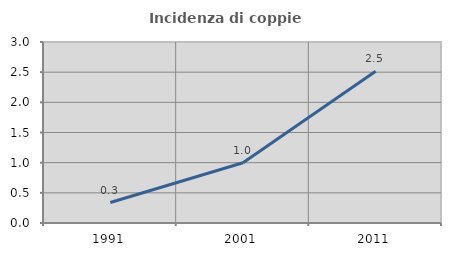
| Category | Incidenza di coppie miste |
|---|---|
| 1991.0 | 0.339 |
| 2001.0 | 0.998 |
| 2011.0 | 2.516 |